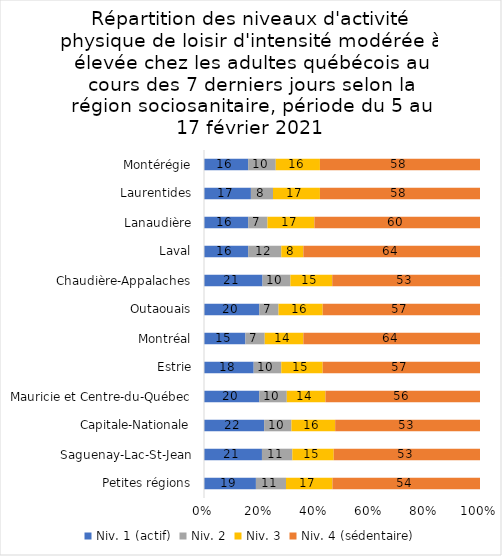
| Category | Niv. 1 (actif) | Niv. 2 | Niv. 3 | Niv. 4 (sédentaire) |
|---|---|---|---|---|
| Petites régions | 19 | 11 | 17 | 54 |
| Saguenay-Lac-St-Jean | 21 | 11 | 15 | 53 |
| Capitale-Nationale | 22 | 10 | 16 | 53 |
| Mauricie et Centre-du-Québec | 20 | 10 | 14 | 56 |
| Estrie | 18 | 10 | 15 | 57 |
| Montréal | 15 | 7 | 14 | 64 |
| Outaouais | 20 | 7 | 16 | 57 |
| Chaudière-Appalaches | 21 | 10 | 15 | 53 |
| Laval | 16 | 12 | 8 | 64 |
| Lanaudière | 16 | 7 | 17 | 60 |
| Laurentides | 17 | 8 | 17 | 58 |
| Montérégie | 16 | 10 | 16 | 58 |